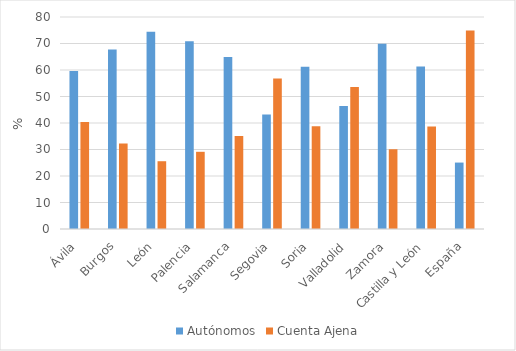
| Category | Autónomos | Cuenta Ajena |
|---|---|---|
| Ávila | 59.635 | 40.365 |
| Burgos | 67.732 | 32.268 |
| León | 74.423 | 25.577 |
| Palencia | 70.868 | 29.132 |
| Salamanca | 64.887 | 35.113 |
| Segovia | 43.183 | 56.817 |
| Soria | 61.181 | 38.819 |
| Valladolid | 46.409 | 53.591 |
| Zamora | 69.903 | 30.097 |
| Castilla y León | 61.302 | 38.698 |
| España | 25.069 | 74.931 |